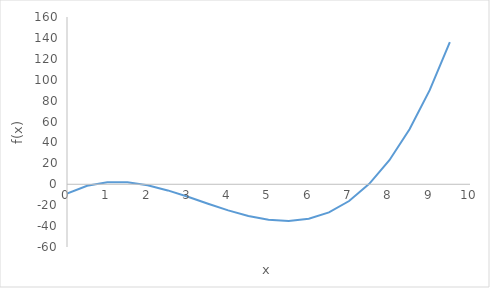
| Category | f(x) |
|---|---|
| 0.0 | -9 |
| 0.5 | -1.375 |
| 1.0 | 2 |
| 1.5 | 1.875 |
| 2.0 | -1 |
| 2.5 | -5.875 |
| 3.0 | -12 |
| 3.5 | -18.625 |
| 4.0 | -25 |
| 4.5 | -30.375 |
| 5.0 | -34 |
| 5.5 | -35.125 |
| 6.0 | -33 |
| 6.5 | -26.875 |
| 7.0 | -16 |
| 7.5 | 0.375 |
| 8.0 | 23 |
| 8.5 | 52.625 |
| 9.0 | 90 |
| 9.5 | 135.875 |